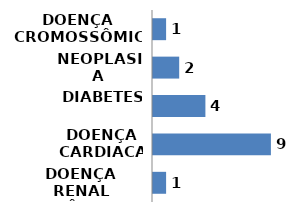
| Category | Series 0 |
|---|---|
| DOENÇA RENAL CRÔNICA | 1 |
| DOENÇA CARDIACA | 9 |
| DIABETES | 4 |
| NEOPLASIA | 2 |
| DOENÇA CROMOSSÔMICA | 1 |